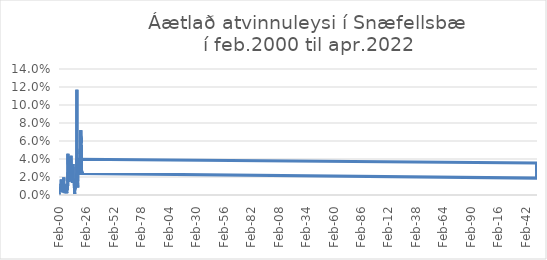
| Category | Áætlað atvinnuleysi |
|---|---|
| 2000-02-01 | 0.003 |
| 2000-03-01 | 0.004 |
| 2000-04-01 | 0 |
| 2000-05-01 | 0.002 |
| 2000-06-01 | 0.004 |
| 2000-07-01 | 0.005 |
| 2000-08-01 | 0.007 |
| 2000-09-01 | 0.006 |
| 2000-10-01 | 0.009 |
| 2000-11-01 | 0.009 |
| 2000-12-01 | 0.009 |
| 2001-01-01 | 0.007 |
| 2001-02-01 | 0.004 |
| 2001-03-01 | 0.005 |
| 2001-04-01 | 0.007 |
| 2001-05-01 | 0.004 |
| 2001-06-01 | 0.004 |
| 2001-07-01 | 0.005 |
| 2001-08-01 | 0.004 |
| 2001-09-01 | 0.003 |
| 2001-10-01 | 0.005 |
| 2001-11-01 | 0.006 |
| 2001-12-01 | 0.009 |
| 2002-01-01 | 0.012 |
| 2002-02-01 | 0.009 |
| 2002-03-01 | 0.013 |
| 2002-04-01 | 0.017 |
| 2002-05-01 | 0.012 |
| 2002-06-01 | 0.011 |
| 2002-07-01 | 0.01 |
| 2002-08-01 | 0.011 |
| 2002-09-01 | 0.011 |
| 2002-10-01 | 0.011 |
| 2002-11-01 | 0.016 |
| 2002-12-01 | 0.012 |
| 2003-01-01 | 0.011 |
| 2003-02-01 | 0.016 |
| 2003-03-01 | 0.016 |
| 2003-04-01 | 0.015 |
| 2003-05-01 | 0.011 |
| 2003-06-01 | 0.011 |
| 2003-07-01 | 0.011 |
| 2003-08-01 | 0.005 |
| 2003-09-01 | 0.004 |
| 2003-10-01 | 0.003 |
| 2003-11-01 | 0.002 |
| 2003-12-01 | 0.007 |
| 2004-01-01 | 0.008 |
| 2004-02-01 | 0.008 |
| 2004-03-01 | 0.01 |
| 2004-04-01 | 0.012 |
| 2004-05-01 | 0.011 |
| 2004-06-01 | 0.01 |
| 2004-07-01 | 0.019 |
| 2004-08-01 | 0.012 |
| 2004-09-01 | 0.008 |
| 2004-10-01 | 0.011 |
| 2004-11-01 | 0.004 |
| 2004-12-01 | 0.004 |
| 2005-01-01 | 0.002 |
| 2005-02-01 | 0.003 |
| 2005-03-01 | 0.002 |
| 2005-04-01 | 0.004 |
| 2005-05-01 | 0.004 |
| 2005-06-01 | 0.005 |
| 2005-07-01 | 0.007 |
| 2005-08-01 | 0.007 |
| 2005-09-01 | 0.005 |
| 2005-10-01 | 0.005 |
| 2005-11-01 | 0.003 |
| 2005-12-01 | 0.004 |
| 2006-01-01 | 0.008 |
| 2006-02-01 | 0.011 |
| 2006-03-01 | 0.01 |
| 2006-04-01 | 0.008 |
| 2006-05-01 | 0.009 |
| 2006-06-01 | 0.007 |
| 2006-07-01 | 0.01 |
| 2006-08-01 | 0.011 |
| 2006-09-01 | 0.009 |
| 2006-10-01 | 0.008 |
| 2006-11-01 | 0.005 |
| 2006-12-01 | 0.006 |
| 2007-01-01 | 0.007 |
| 2007-02-01 | 0.007 |
| 2007-03-01 | 0.007 |
| 2007-04-01 | 0.008 |
| 2007-05-01 | 0.007 |
| 2007-06-01 | 0.002 |
| 2007-07-01 | 0.005 |
| 2007-08-01 | 0.006 |
| 2007-09-01 | 0.01 |
| 2007-10-01 | 0.012 |
| 2007-11-01 | 0.008 |
| 2007-12-01 | 0.005 |
| 2008-01-01 | 0.012 |
| 2008-02-01 | 0.012 |
| 2008-03-01 | 0.012 |
| 2008-04-01 | 0.009 |
| 2008-05-01 | 0.025 |
| 2008-06-01 | 0.044 |
| 2008-07-01 | 0.046 |
| 2008-08-01 | 0.034 |
| 2008-09-01 | 0.018 |
| 2008-10-01 | 0.014 |
| 2008-11-01 | 0.019 |
| 2008-12-01 | 0.02 |
| 2009-01-01 | 0.019 |
| 2009-02-01 | 0.02 |
| 2009-03-01 | 0.025 |
| 2009-04-01 | 0.024 |
| 2009-05-01 | 0.021 |
| 2009-06-01 | 0.02 |
| 2009-07-01 | 0.041 |
| 2009-08-01 | 0.026 |
| 2009-09-01 | 0.017 |
| 2009-10-01 | 0.023 |
| 2009-11-01 | 0.03 |
| 2009-12-01 | 0.026 |
| 2010-01-01 | 0.027 |
| 2010-02-01 | 0.027 |
| 2010-03-01 | 0.026 |
| 2010-04-01 | 0.028 |
| 2010-05-01 | 0.035 |
| 2010-06-01 | 0.036 |
| 2010-07-01 | 0.042 |
| 2010-08-01 | 0.029 |
| 2010-09-01 | 0.023 |
| 2010-10-01 | 0.024 |
| 2010-11-01 | 0.023 |
| 2010-12-01 | 0.023 |
| 2011-01-01 | 0.026 |
| 2011-02-01 | 0.033 |
| 2011-03-01 | 0.035 |
| 2011-04-01 | 0.03 |
| 2011-05-01 | 0.03 |
| 2011-06-01 | 0.039 |
| 2011-07-01 | 0.044 |
| 2011-08-01 | 0.025 |
| 2011-09-01 | 0.018 |
| 2011-10-01 | 0.017 |
| 2011-11-01 | 0.017 |
| 2011-12-01 | 0.015 |
| 2012-01-01 | 0.018 |
| 2012-02-01 | 0.016 |
| 2012-03-01 | 0.021 |
| 2012-04-01 | 0.02 |
| 2012-05-01 | 0.016 |
| 2012-06-01 | 0.03 |
| 2012-07-01 | 0.034 |
| 2012-08-01 | 0.033 |
| 2012-09-01 | 0.018 |
| 2012-10-01 | 0.014 |
| 2012-11-01 | 0.017 |
| 2012-12-01 | 0.016 |
| 2013-01-01 | 0.014 |
| 2013-02-01 | 0.016 |
| 2013-03-01 | 0.02 |
| 2013-04-01 | 0.021 |
| 2013-05-01 | 0.022 |
| 2013-06-01 | 0.034 |
| 2013-07-01 | 0.034 |
| 2013-08-01 | 0.035 |
| 2013-09-01 | 0.018 |
| 2013-10-01 | 0.018 |
| 2013-11-01 | 0.016 |
| 2013-12-01 | 0.015 |
| 2014-01-01 | 0.018 |
| 2014-02-01 | 0.017 |
| 2014-03-01 | 0.017 |
| 2014-04-01 | 0.016 |
| 2014-05-01 | 0.014 |
| 2014-06-01 | 0.018 |
| 2014-07-01 | 0.018 |
| 2014-08-01 | 0.011 |
| 2014-09-01 | 0.011 |
| 2014-10-01 | 0.003 |
| 2014-11-01 | 0.003 |
| 2014-12-01 | 0.001 |
| 2015-01-01 | 0.003 |
| 2015-02-01 | 0.003 |
| 2015-03-01 | 0.005 |
| 2015-04-01 | 0.009 |
| 2015-05-01 | 0.006 |
| 2015-06-01 | 0.017 |
| 2015-07-01 | 0.016 |
| 2015-08-01 | 0.015 |
| 2015-09-01 | 0.015 |
| 2015-10-01 | 0.009 |
| 2015-11-01 | 0.012 |
| 2015-12-01 | 0.016 |
| 2016-01-01 | 0.016 |
| 2016-02-01 | 0.015 |
| 2016-03-01 | 0.012 |
| 2016-04-01 | 0.011 |
| 2016-05-01 | 0.009 |
| 2016-06-01 | 0.016 |
| 2016-07-01 | 0.016 |
| 2016-08-01 | 0.024 |
| 2016-09-01 | 0.022 |
| 2016-10-01 | 0.021 |
| 2016-11-01 | 0.019 |
| 2016-12-01 | 0.04 |
| 2017-01-01 | 0.117 |
| 2017-02-01 | 0.029 |
| 2017-03-01 | 0.025 |
| 2017-04-01 | 0.024 |
| 2017-05-01 | 0.023 |
| 2017-06-01 | 0.033 |
| 2017-07-01 | 0.031 |
| 2017-08-01 | 0.031 |
| 2017-09-01 | 0.017 |
| 2017-10-01 | 0.008 |
| 2017-11-01 | 0.014 |
| 2017-12-01 | 0.015 |
| 2018-01-01 | 0.016 |
| 2018-02-01 | 0.018 |
| 2018-03-01 | 0.029 |
| 2018-04-01 | 0.032 |
| 2018-05-01 | 0.027 |
| 2018-06-01 | 0.032 |
| 2018-07-01 | 0.04 |
| 201808.0 | 0.036 |
| 201809.0 | 0.025 |
| 201810.0 | 0.022 |
| 201811.0 | 0.019 |
| 201812.0 | 0.019 |
| 201901.0 | 0.023 |
| 201902.0 | 0.022 |
| 201903.0 | 0.022 |
| 201904.0 | 0.025 |
| 201905.0 | 0.032 |
| 201906.0 | 0.033 |
| 201907.0 | 0.027 |
| 201908.0 | 0.034 |
| 201909.0 | 0.024 |
| 201910.0 | 0.019 |
| 201911.0 | 0.02 |
| 2019-12-01 | 0.024 |
| 2020-01-01 | 0.028 |
| 2020-02-01 | 0.024 |
| 2020-03-01 | 0.049 |
| 2020-04-01 | 0.051 |
| 2020-05-01 | 0.046 |
| 2020-06-01 | 0.066 |
| 2020-07-01 | 0.059 |
| 2020-08-01 | 0.063 |
| 2020-09-01 | 0.058 |
| 2020-10-01 | 0.072 |
| 2020-11-01 | 0.062 |
| 2020-12-01 | 0.06 |
| 2021-01-01 | 0.063 |
| 2021-02-01 | 0.059 |
| 2021-03-01 | 0.064 |
| 2021-04-01 | 0.058 |
| 2021-05-01 | 0.059 |
| 2021-06-01 | 0.044 |
| 2021-07-01 | 0.028 |
| 2021-08-01 | 0.027 |
| 2021-09-01 | 0.023 |
| 2021-10-01 | 0.022 |
| 2021-11-01 | 0.025 |
| 2021-12-01 | 0.026 |
| 2022-01-01 | 0.026 |
| 2022-02-01 | 0.024 |
| 2022-03-01 | 0.025 |
| 2022-04-01 | 0.026 |